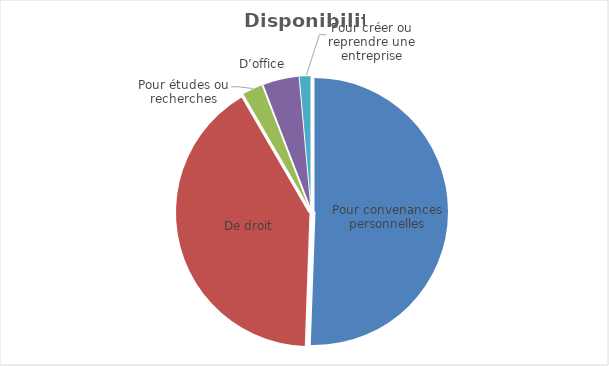
| Category | Disponibilité |
|---|---|
| Pour convenances personnelles | 50.563 |
| De droit | 41.06 |
| Pour études ou recherches | 2.53 |
| D’office | 4.426 |
| Pour créer ou reprendre une entreprise | 1.42 |